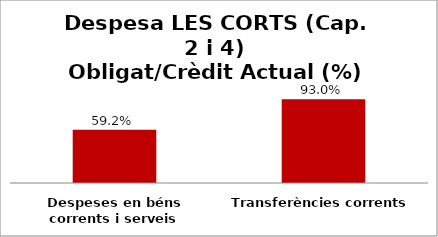
| Category | Series 0 |
|---|---|
| Despeses en béns corrents i serveis | 0.592 |
| Transferències corrents | 0.93 |